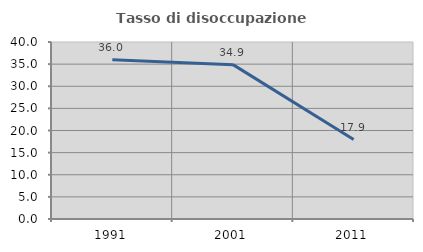
| Category | Tasso di disoccupazione giovanile  |
|---|---|
| 1991.0 | 36 |
| 2001.0 | 34.884 |
| 2011.0 | 17.949 |